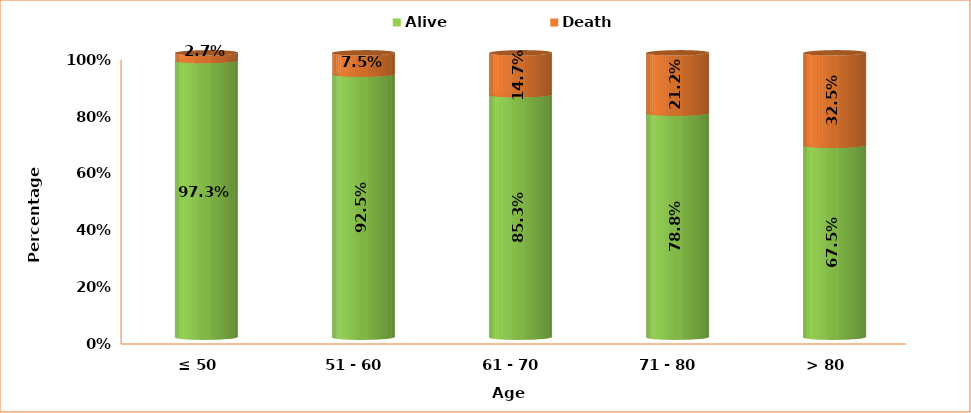
| Category | Alive | Death |
|---|---|---|
| ≤ 50 | 0.973 | 0.027 |
| 51 - 60 | 0.925 | 0.075 |
| 61 - 70 | 0.853 | 0.147 |
| 71 - 80 | 0.788 | 0.212 |
| > 80 | 0.675 | 0.325 |